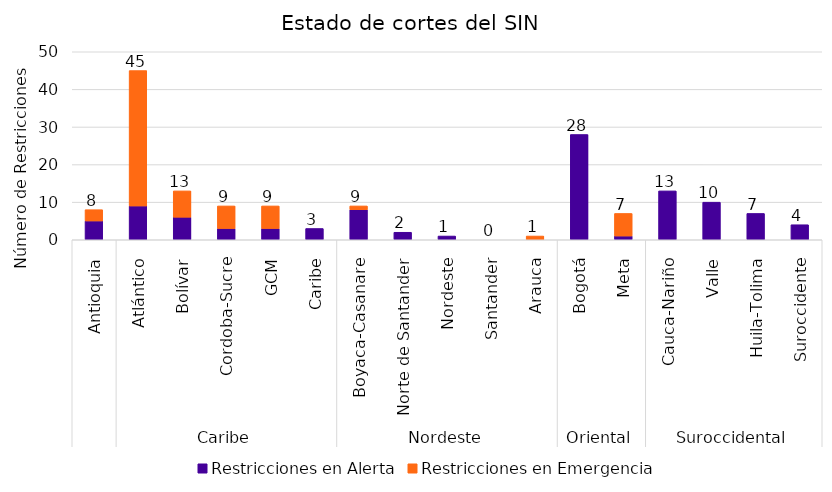
| Category | Restricciones en Alerta | Restricciones en Emergencia | Aux |
|---|---|---|---|
| 0 | 5 | 3 | 0 |
| 1 | 9 | 36 | 0 |
| 2 | 6 | 7 | 0 |
| 3 | 3 | 6 | 0 |
| 4 | 3 | 6 | 0 |
| 5 | 3 | 0 | 0 |
| 6 | 8 | 1 | 0 |
| 7 | 2 | 0 | 0 |
| 8 | 1 | 0 | 0 |
| 9 | 0 | 0 | 0 |
| 10 | 0 | 1 | 0 |
| 11 | 28 | 0 | 0 |
| 12 | 1 | 6 | 0 |
| 13 | 13 | 0 | 0 |
| 14 | 10 | 0 | 0 |
| 15 | 7 | 0 | 0 |
| 16 | 4 | 0 | 0 |